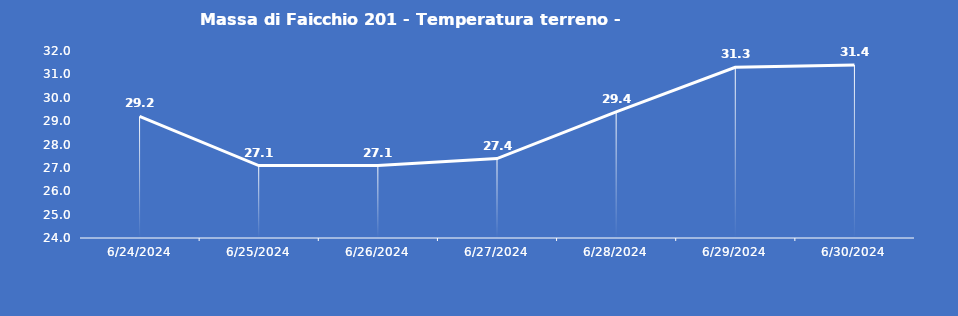
| Category | Massa di Faicchio 201 - Temperatura terreno - Grezzo (°C) |
|---|---|
| 6/24/24 | 29.2 |
| 6/25/24 | 27.1 |
| 6/26/24 | 27.1 |
| 6/27/24 | 27.4 |
| 6/28/24 | 29.4 |
| 6/29/24 | 31.3 |
| 6/30/24 | 31.4 |